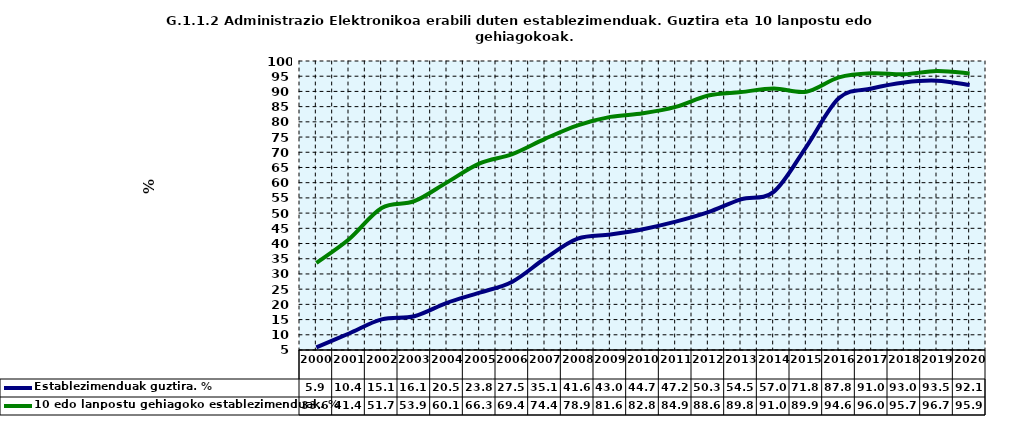
| Category | Establezimenduak guztira. % | 10 edo lanpostu gehiagoko establezimenduak. % |
|---|---|---|
| 2000.0 | 5.883 | 33.627 |
| 2001.0 | 10.421 | 41.411 |
| 2002.0 | 15.068 | 51.694 |
| 2003.0 | 16.098 | 53.904 |
| 2004.0 | 20.515 | 60.107 |
| 2005.0 | 23.837 | 66.349 |
| 2006.0 | 27.46 | 69.402 |
| 2007.0 | 35.078 | 74.42 |
| 2008.0 | 41.612 | 78.862 |
| 2009.0 | 42.972 | 81.627 |
| 2010.0 | 44.715 | 82.794 |
| 2011.0 | 47.2 | 84.9 |
| 2012.0 | 50.321 | 88.639 |
| 2013.0 | 54.524 | 89.774 |
| 2014.0 | 56.986 | 90.972 |
| 2015.0 | 71.8 | 89.9 |
| 2016.0 | 87.813 | 94.63 |
| 2017.0 | 90.959 | 95.964 |
| 2018.0 | 92.961 | 95.655 |
| 2019.0 | 93.517 | 96.71 |
| 2020.0 | 92.114 | 95.9 |